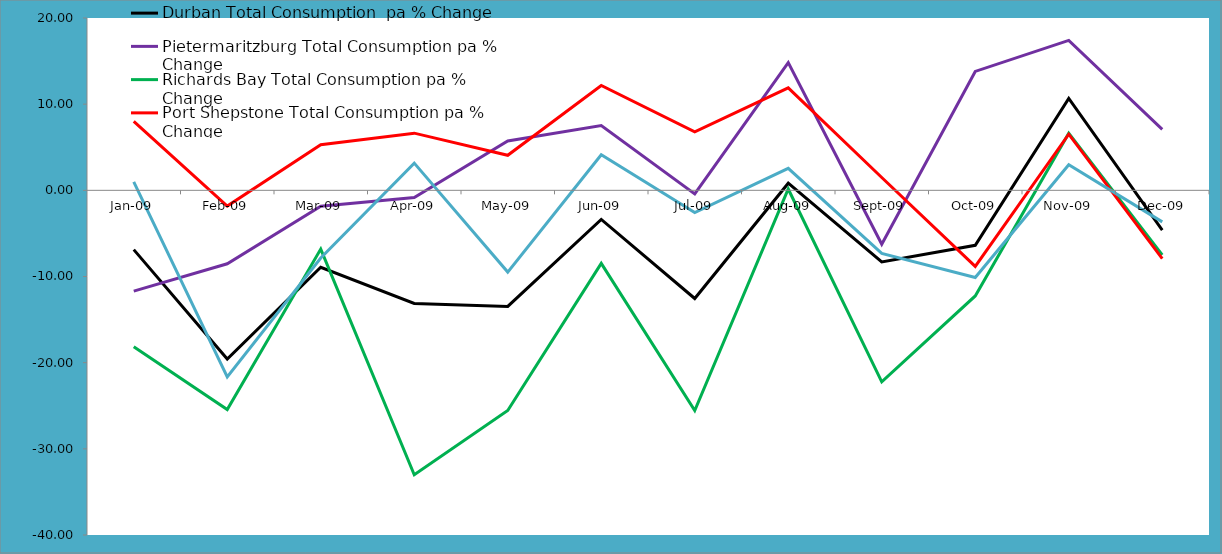
| Category | Durban Total Consumption  pa % Change | Pietermaritzburg Total Consumption pa % Change | Richards Bay Total Consumption pa % Change | Port Shepstone Total Consumption pa % Change | New Castle Total Consumption pa % Change |
|---|---|---|---|---|---|
| 2009-01-01 | -6.879 | -11.699 | -18.146 | 7.998 | 0.986 |
| 2009-02-01 | -19.57 | -8.52 | -25.442 | -1.83 | -21.665 |
| 2009-03-01 | -8.924 | -1.848 | -6.821 | 5.296 | -7.851 |
| 2009-04-01 | -13.124 | -0.83 | -33.011 | 6.635 | 3.159 |
| 2009-05-01 | -13.469 | 5.723 | -25.555 | 4.064 | -9.487 |
| 2009-06-01 | -3.38 | 7.514 | -8.48 | 12.166 | 4.131 |
| 2009-07-01 | -12.553 | -0.42 | -25.565 | 6.793 | -2.574 |
| 2009-08-01 | 0.828 | 14.827 | 0.156 | 11.897 | 2.559 |
| 2009-09-01 | -8.305 | -6.255 | -22.222 | 1.492 | -7.317 |
| 2009-10-01 | -6.377 | 13.797 | -12.258 | -8.825 | -10.123 |
| 2009-11-01 | 10.668 | 17.396 | 6.617 | 6.512 | 2.967 |
| 2009-12-01 | -4.61 | 7.079 | -7.481 | -7.926 | -3.664 |